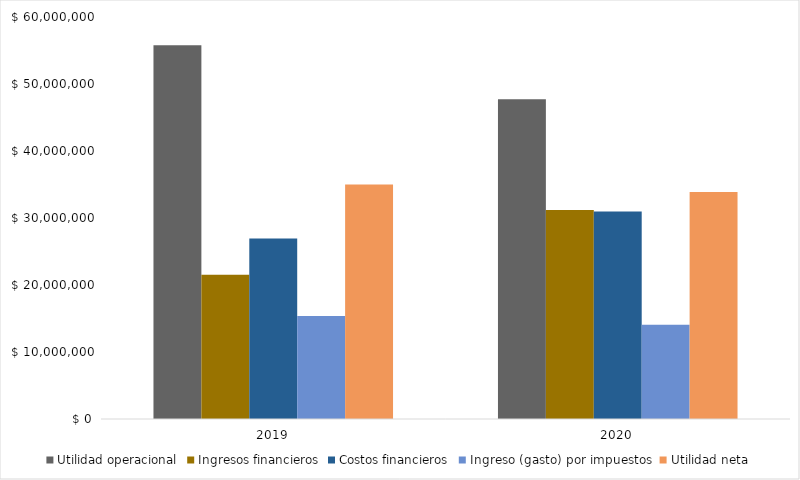
| Category |  Utilidad operacional  |  Ingresos financieros  |  Costos financieros  |  Ingreso (gasto) por impuestos  |  Utilidad neta  |
|---|---|---|---|---|---|
| 2019.0 | 55771679 | 21545547 | 26947947 | 15366816 | 35002463 |
| 2020.0 | 47713249 | 31212038 | 30987417 | 14049840 | 33888030 |